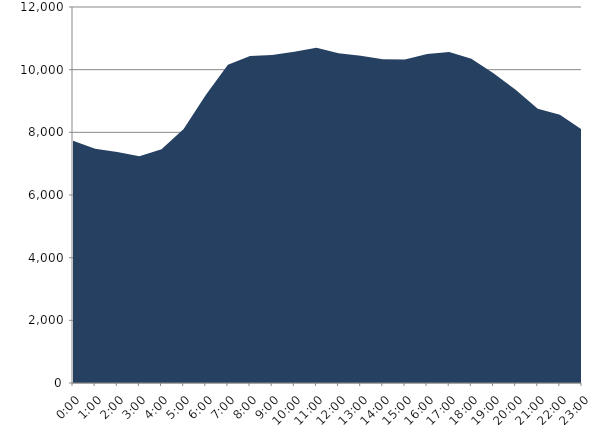
| Category | Series 0 | Series 1 |
|---|---|---|
| 2020-12-16 |  | 7731.515 |
| 2020-12-16 01:00:00 |  | 7475.936 |
| 2020-12-16 02:00:00 |  | 7369.802 |
| 2020-12-16 03:00:00 |  | 7236.595 |
| 2020-12-16 04:00:00 |  | 7459.832 |
| 2020-12-16 05:00:00 |  | 8106.226 |
| 2020-12-16 06:00:00 |  | 9189.761 |
| 2020-12-16 07:00:00 |  | 10158.9 |
| 2020-12-16 08:00:00 |  | 10432.35 |
| 2020-12-16 09:00:00 |  | 10466.618 |
| 2020-12-16 10:00:00 |  | 10571.972 |
| 2020-12-16 11:00:00 |  | 10701.027 |
| 2020-12-16 12:00:00 |  | 10524.463 |
| 2020-12-16 13:00:00 |  | 10447.717 |
| 2020-12-16 14:00:00 |  | 10333.01 |
| 2020-12-16 15:00:00 |  | 10326.586 |
| 2020-12-16 16:00:00 |  | 10503.212 |
| 2020-12-16 17:00:00 |  | 10560.817 |
| 2020-12-16 18:00:00 |  | 10347.226 |
| 2020-12-16 19:00:00 |  | 9886.409 |
| 2020-12-16 20:00:00 |  | 9362.846 |
| 2020-12-16 21:00:00 |  | 8756.461 |
| 2020-12-16 22:00:00 |  | 8565.124 |
| 2020-12-16 23:00:00 |  | 8087.021 |